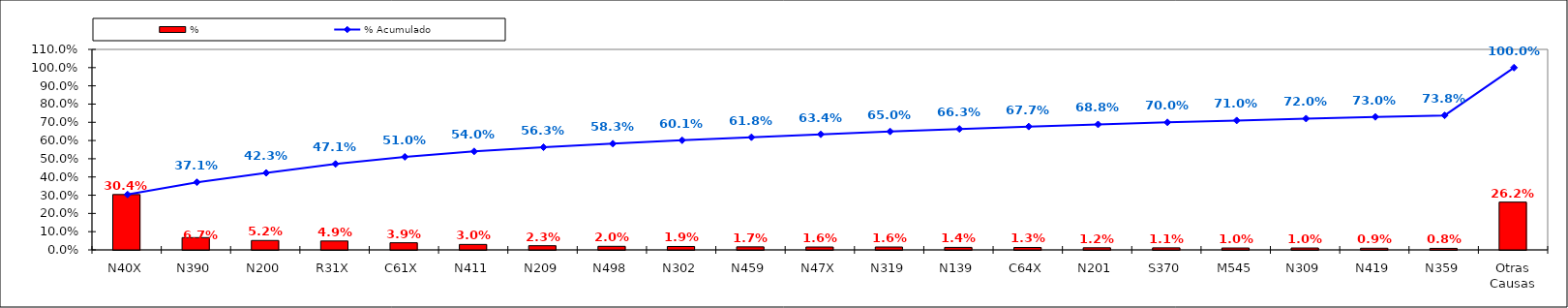
| Category | % |
|---|---|
| N40X | 0.304 |
| N390 | 0.067 |
| N200 | 0.052 |
| R31X | 0.049 |
| C61X | 0.039 |
| N411 | 0.03 |
| N209 | 0.023 |
| N498 | 0.02 |
| N302 | 0.019 |
| N459 | 0.017 |
| N47X | 0.016 |
| N319 | 0.016 |
| N139 | 0.014 |
| C64X | 0.013 |
| N201 | 0.012 |
| S370 | 0.011 |
| M545 | 0.01 |
| N309 | 0.01 |
| N419 | 0.009 |
| N359 | 0.008 |
| Otras Causas | 0.262 |